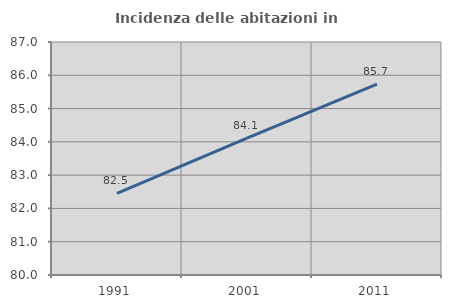
| Category | Incidenza delle abitazioni in proprietà  |
|---|---|
| 1991.0 | 82.455 |
| 2001.0 | 84.112 |
| 2011.0 | 85.734 |